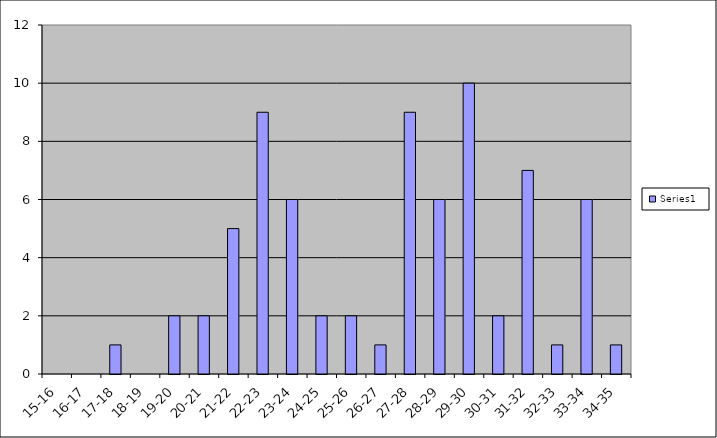
| Category | Series 0 |
|---|---|
| 15-16 | 0 |
| 16-17 | 0 |
| 17-18 | 1 |
| 18-19 | 0 |
| 19-20 | 2 |
| 20-21 | 2 |
| 21-22 | 5 |
| 22-23 | 9 |
| 23-24 | 6 |
| 24-25 | 2 |
| 25-26 | 2 |
| 26-27 | 1 |
| 27-28 | 9 |
| 28-29 | 6 |
| 29-30 | 10 |
| 30-31 | 2 |
| 31-32 | 7 |
| 32-33 | 1 |
| 33-34 | 6 |
| 34-35 | 1 |